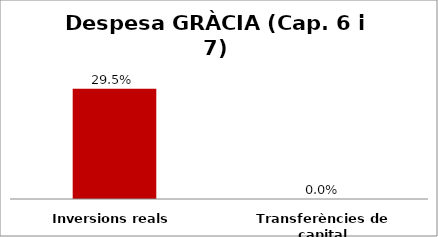
| Category | Series 0 |
|---|---|
| Inversions reals | 0.295 |
| Transferències de capital | 0 |